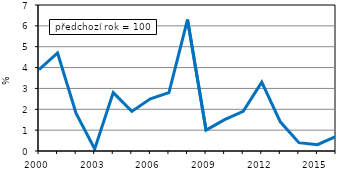
| Category | Series 0 |
|---|---|
| 2000.0 | 3.9 |
| 2001.0 | 4.7 |
| 2002.0 | 1.8 |
| 2003.0 | 0.1 |
| 2004.0 | 2.8 |
| 2005.0 | 1.9 |
| 2006.0 | 2.5 |
| 2007.0 | 2.8 |
| 2008.0 | 6.3 |
| 2009.0 | 1 |
| 2010.0 | 1.5 |
| 2011.0 | 1.9 |
| 2012.0 | 3.3 |
| 2013.0 | 1.4 |
| 2014.0 | 0.4 |
| 2015.0 | 0.3 |
| 2016.0 | 0.7 |